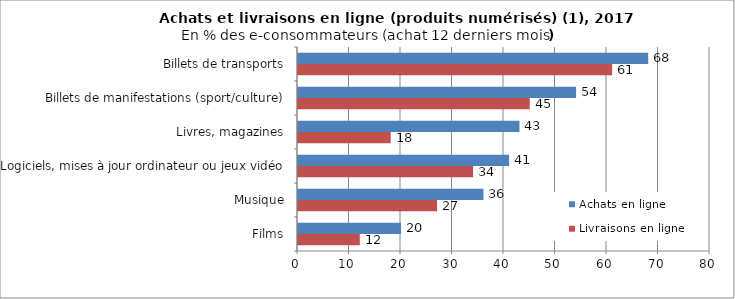
| Category | Livraisons en ligne | Achats en ligne |
|---|---|---|
| Films | 12 | 20 |
| Musique | 27 | 36 |
| Logiciels, mises à jour ordinateur ou jeux vidéo | 34 | 41 |
| Livres, magazines | 18 | 43 |
| Billets de manifestations (sport/culture) | 45 | 54 |
| Billets de transports | 61 | 68 |